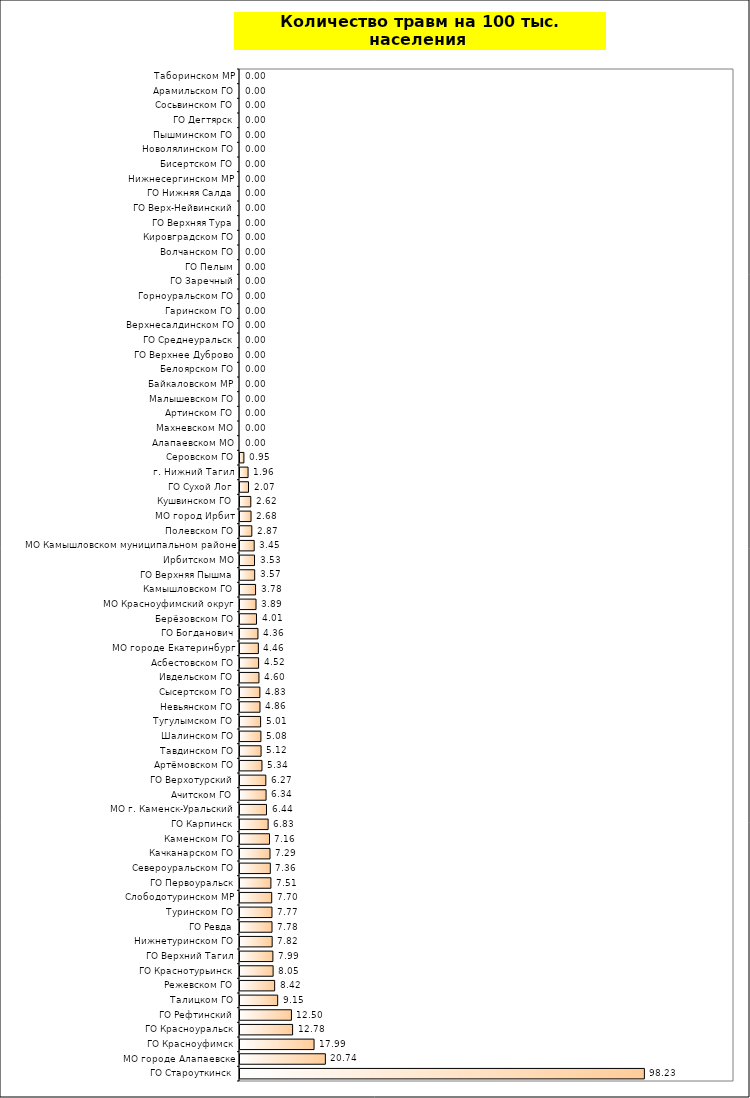
| Category | Series 0 |
|---|---|
| ГО Староуткинск | 98.232 |
| МО городе Алапаевске | 20.739 |
| ГО Красноуфимск | 17.988 |
| ГО Красноуральск | 12.78 |
| ГО Рефтинский | 12.496 |
| Талицком ГО | 9.154 |
| Режевском ГО | 8.419 |
| ГО Краснотурьинск | 8.049 |
| ГО Верхний Тагил | 7.988 |
| Нижнетуринском ГО | 7.818 |
| ГО Ревда | 7.775 |
| Туринском ГО | 7.768 |
| Слободотуринском МР | 7.705 |
| ГО Первоуральск | 7.507 |
| Североуральском ГО | 7.364 |
| Качканарском ГО | 7.288 |
| Каменском ГО | 7.164 |
| ГО Карпинск | 6.832 |
| МО г. Каменск-Уральский | 6.439 |
| Ачитском ГО | 6.337 |
| ГО Верхотурский | 6.272 |
| Артёмовском ГО | 5.335 |
| Тавдинском ГО | 5.124 |
| Шалинском ГО | 5.078 |
| Тугулымском ГО | 5.01 |
| Невьянском ГО | 4.857 |
| Сысертском ГО | 4.829 |
| Ивдельском ГО | 4.602 |
| Асбестовском ГО | 4.518 |
| МО городе Екатеринбург | 4.462 |
| ГО Богданович | 4.36 |
| Берёзовском ГО | 4.011 |
| МО Красноуфимский округ | 3.893 |
| Камышловском ГО | 3.783 |
| ГО Верхняя Пышма | 3.567 |
| Ирбитском МО | 3.529 |
| МО Камышловском муниципальном районе | 3.453 |
| Полевском ГО | 2.87 |
| МО город Ирбит | 2.681 |
| Кушвинском ГО | 2.622 |
| ГО Сухой Лог | 2.068 |
| г. Нижний Тагил | 1.962 |
| Серовском ГО | 0.946 |
| Алапаевском МО | 0 |
| Махневском МО | 0 |
| Артинском ГО | 0 |
| Малышевском ГО | 0 |
| Байкаловском МР | 0 |
| Белоярском ГО | 0 |
| ГО Верхнее Дуброво | 0 |
| ГО Среднеуральск | 0 |
| Верхнесалдинском ГО | 0 |
| Гаринском ГО | 0 |
| Горноуральском ГО | 0 |
| ГО Заречный | 0 |
| ГО Пелым | 0 |
| Волчанском ГО | 0 |
| Кировградском ГО | 0 |
| ГО Верхняя Тура | 0 |
| ГО Верх-Нейвинский | 0 |
| ГО Нижняя Салда | 0 |
| Нижнесергинском МР | 0 |
| Бисертском ГО | 0 |
| Новолялинском ГО | 0 |
| Пышминском ГО | 0 |
| ГО Дегтярск | 0 |
| Сосьвинском ГО | 0 |
| Арамильском ГО | 0 |
| Таборинском МР | 0 |